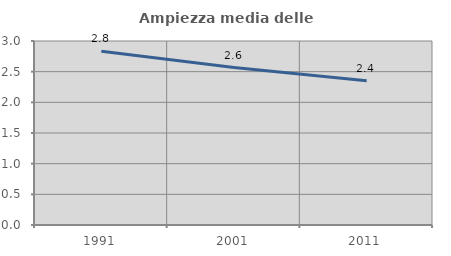
| Category | Ampiezza media delle famiglie |
|---|---|
| 1991.0 | 2.833 |
| 2001.0 | 2.567 |
| 2011.0 | 2.351 |